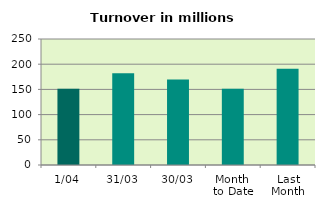
| Category | Series 0 |
|---|---|
| 1/04 | 151.181 |
| 31/03 | 181.88 |
| 30/03 | 169.645 |
| Month 
to Date | 151.181 |
| Last
Month | 190.797 |